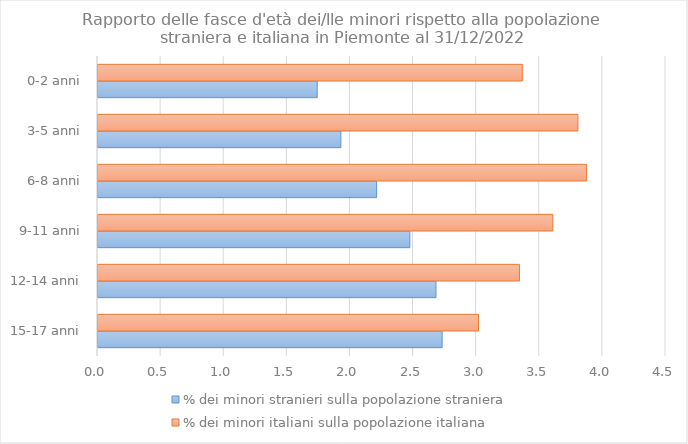
| Category | % dei minori stranieri sulla popolazione straniera | % dei minori italiani sulla popolazione italiana |
|---|---|---|
| 15-17 anni | 2.727 | 3.014 |
| 12-14 anni | 2.678 | 3.339 |
| 9-11 anni | 2.471 | 3.603 |
| 6-8 anni | 2.208 | 3.871 |
| 3-5 anni | 1.924 | 3.802 |
| 0-2 anni | 1.737 | 3.361 |